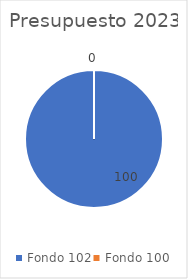
| Category | Series 0 |
|---|---|
| Fondo 102 | 100 |
| Fondo 100 | 0 |